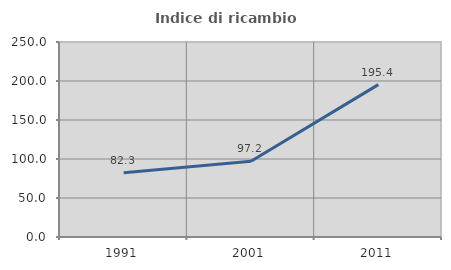
| Category | Indice di ricambio occupazionale  |
|---|---|
| 1991.0 | 82.274 |
| 2001.0 | 97.203 |
| 2011.0 | 195.392 |